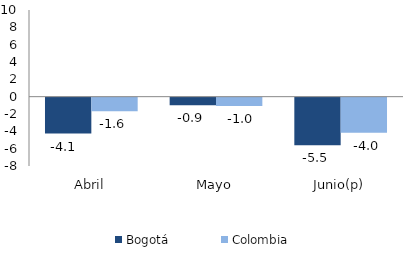
| Category | Bogotá | Colombia |
|---|---|---|
| Abril | -4.138 | -1.557 |
| Mayo | -0.879 | -0.972 |
| Junio(p) | -5.502 | -4.044 |